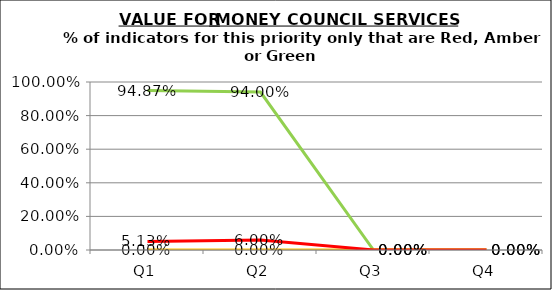
| Category | Green | Amber | Red |
|---|---|---|---|
| Q1 | 0.949 | 0 | 0.051 |
| Q2 | 0.94 | 0 | 0.06 |
| Q3 | 0 | 0 | 0 |
| Q4 | 0 | 0 | 0 |